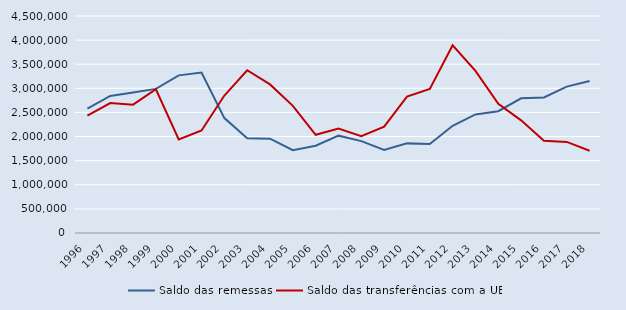
| Category | Saldo das remessas | Saldo das transferências com a UE |
|---|---|---|
| 1996.0 | 2581600 | 2435690 |
| 1997.0 | 2843130 | 2694280 |
| 1998.0 | 2914820 | 2661310 |
| 1999.0 | 2988410 | 2980400 |
| 2000.0 | 3269160 | 1940870 |
| 2001.0 | 3326730 | 2126650 |
| 2002.0 | 2382380 | 2851530 |
| 2003.0 | 1966680 | 3374690 |
| 2004.0 | 1956570 | 3081470 |
| 2005.0 | 1717260 | 2636830 |
| 2006.0 | 1810500 | 2036230 |
| 2007.0 | 2018420 | 2167980 |
| 2008.0 | 1904680 | 2005940 |
| 2009.0 | 1722660 | 2206820 |
| 2010.0 | 1858560 | 2827070 |
| 2011.0 | 1844870 | 2987260 |
| 2012.0 | 2223930 | 3892440 |
| 2013.0 | 2459730 | 3360910 |
| 2014.0 | 2525900 | 2680000 |
| 2015.0 | 2793010 | 2336120 |
| 2016.0 | 2809870 | 1911870 |
| 2017.0 | 3036510 | 1888830 |
| 2018.0 | 3152660 | 1706790 |